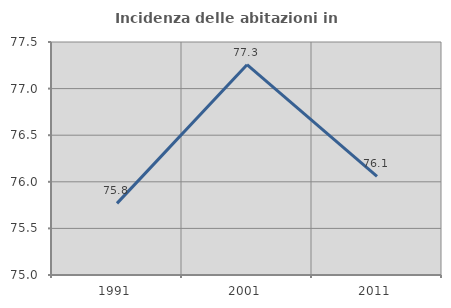
| Category | Incidenza delle abitazioni in proprietà  |
|---|---|
| 1991.0 | 75.769 |
| 2001.0 | 77.256 |
| 2011.0 | 76.058 |